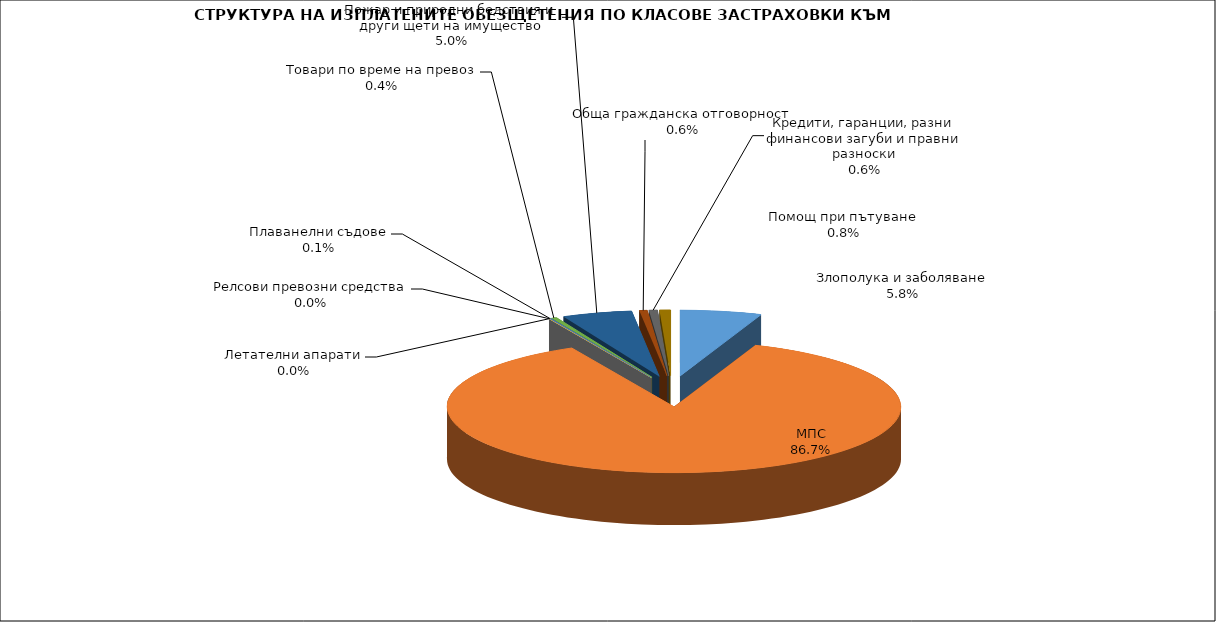
| Category | Series 0 |
|---|---|
| Злополука и заболяване | 0.058 |
| МПС | 0.867 |
| Релсови превозни средства | 0 |
| Летателни апарати | 0 |
| Плаванелни съдове | 0.001 |
| Товари по време на превоз | 0.004 |
| Пожар и природни бедствия и други щети на имущество | 0.05 |
| Обща гражданска отговорност | 0.006 |
| Кредити, гаранции, разни финансови загуби и правни разноски | 0.006 |
| Помощ при пътуване | 0.008 |